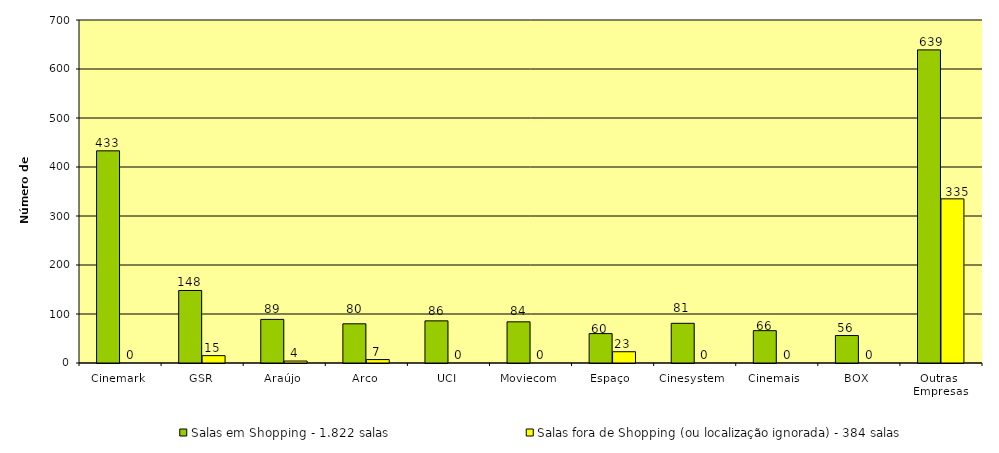
| Category | Salas em Shopping - 1.822 salas | Salas fora de Shopping (ou localização ignorada) - 384 salas |
|---|---|---|
| Cinemark | 433 | 0 |
| GSR | 148 | 15 |
| Araújo | 89 | 4 |
| Arco | 80 | 7 |
| UCI | 86 | 0 |
| Moviecom | 84 | 0 |
| Espaço | 60 | 23 |
| Cinesystem | 81 | 0 |
| Cinemais | 66 | 0 |
| BOX | 56 | 0 |
| Outras  Empresas | 639 | 335 |